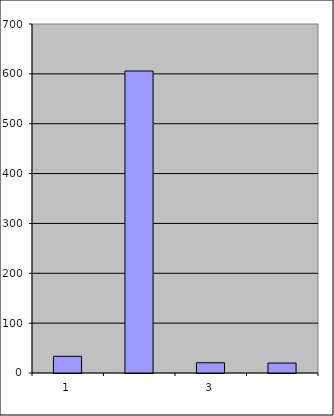
| Category | Series 0 |
|---|---|
| 0 | 33.5 |
| 1 | 605.707 |
| 2 | 20.473 |
| 3 | 19.943 |